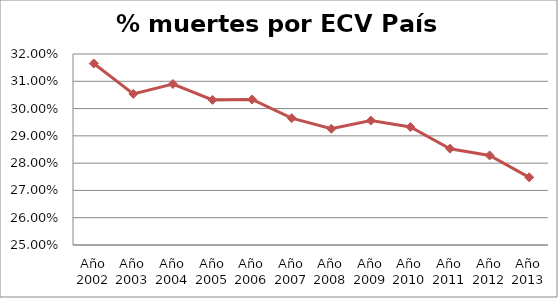
| Category | Series 0 |
|---|---|
| Año 2002 | 0.317 |
| Año 2003 | 0.305 |
| Año 2004 | 0.309 |
| Año 2005 | 0.303 |
| Año 2006 | 0.303 |
| Año 2007 | 0.297 |
| Año 2008 | 0.293 |
| Año 2009 | 0.296 |
| Año 2010 | 0.293 |
| Año 2011 | 0.285 |
| Año 2012 | 0.283 |
| Año 2013 | 0.275 |